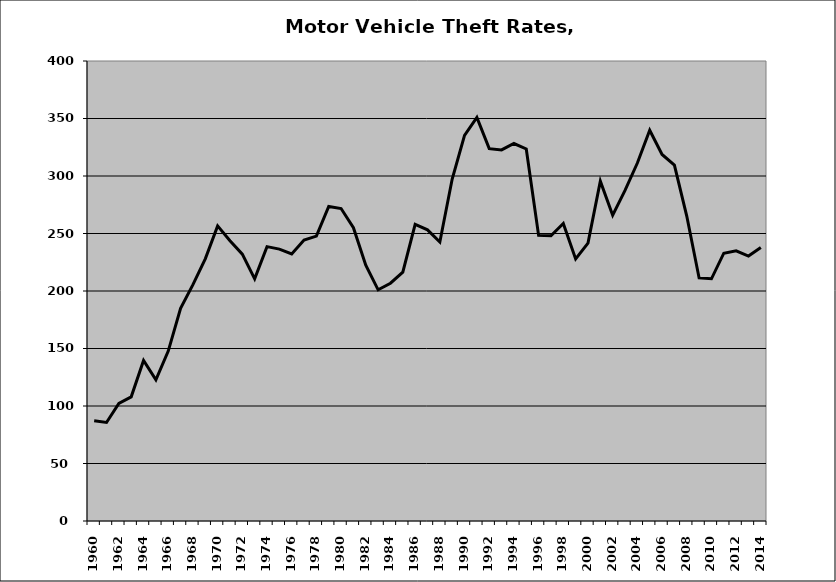
| Category | Motor Vehicle |
|---|---|
| 1960.0 | 87.212 |
| 1961.0 | 85.688 |
| 1962.0 | 102.253 |
| 1963.0 | 107.955 |
| 1964.0 | 139.596 |
| 1965.0 | 122.695 |
| 1966.0 | 147.778 |
| 1967.0 | 184.879 |
| 1968.0 | 205.515 |
| 1969.0 | 227.962 |
| 1970.0 | 256.639 |
| 1971.0 | 243.756 |
| 1972.0 | 232.019 |
| 1973.0 | 210.531 |
| 1974.0 | 238.59 |
| 1975.0 | 236.436 |
| 1976.0 | 232.251 |
| 1977.0 | 244.325 |
| 1978.0 | 247.7 |
| 1979.0 | 273.491 |
| 1980.0 | 271.702 |
| 1981.0 | 255.061 |
| 1982.0 | 222.508 |
| 1983.0 | 201.031 |
| 1984.0 | 206.768 |
| 1985.0 | 216.367 |
| 1986.0 | 257.985 |
| 1987.0 | 253.15 |
| 1988.0 | 242.541 |
| 1989.0 | 297.374 |
| 1990.0 | 335.368 |
| 1991.0 | 350.982 |
| 1992.0 | 323.781 |
| 1993.0 | 322.679 |
| 1994.0 | 328.23 |
| 1995.0 | 323.548 |
| 1996.0 | 248.367 |
| 1997.0 | 248.092 |
| 1998.0 | 258.692 |
| 1999.0 | 227.878 |
| 2000.0 | 241.629 |
| 2001.0 | 295.508 |
| 2002.0 | 265.952 |
| 2003.0 | 287.435 |
| 2004.0 | 311.3 |
| 2005.0 | 339.79 |
| 2006.0 | 318.696 |
| 2007.0 | 309.51 |
| 2008.0 | 265.177 |
| 2009.0 | 211.371 |
| 2010.0 | 210.612 |
| 2011.0 | 232.861 |
| 2012.0 | 234.942 |
| 2013.0 | 230.368 |
| 2014.0 | 237.808 |